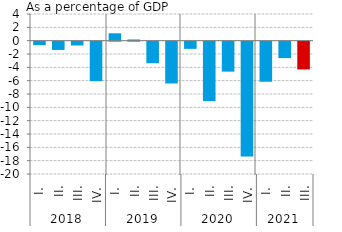
| Category | Series 0 |
|---|---|
| 0 | -0.523 |
| 1 | -1.243 |
| 2 | -0.571 |
| 3 | -5.926 |
| 4 | 1.101 |
| 5 | 0.18 |
| 6 | -3.23 |
| 7 | -6.268 |
| 8 | -1.076 |
| 9 | -8.912 |
| 10 | -4.496 |
| 11 | -17.224 |
| 12 | -6.012 |
| 13 | -2.469 |
| 14 | -4.169 |